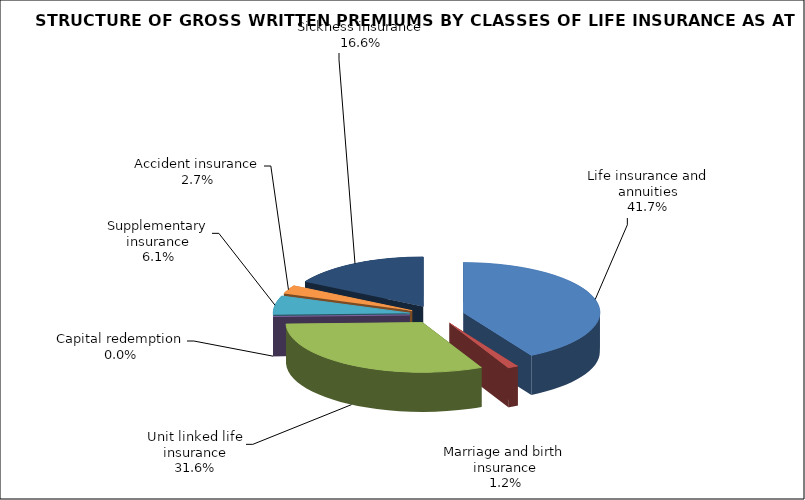
| Category | Series 0 |
|---|---|
| Life insurance and annuities | 40541396.184 |
| Marriage and birth insurance | 1197650.837 |
| Unit linked life insurance | 30729242.21 |
| Capital redemption | 0 |
| Supplementary insurance | 5930845.981 |
| Accident insurance | 2669175.05 |
| Sickness insurance | 16186128.19 |